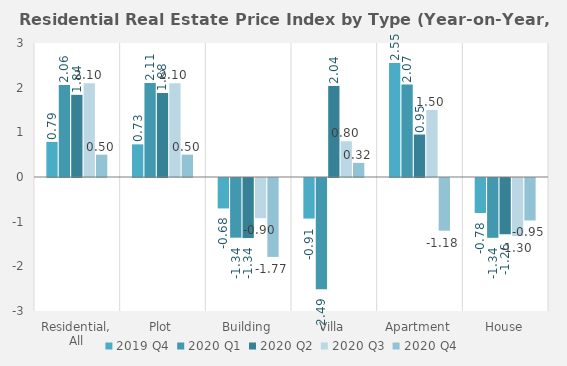
| Category | 2019 | 2020 |
|---|---|---|
| Residential, All | 0.786 | 0.5 |
| Plot | 0.731 | 0.5 |
| Building | -0.682 | -1.766 |
| Villa | -0.908 | 0.316 |
| Apartment | 2.55 | -1.18 |
| House | -0.783 | -0.95 |